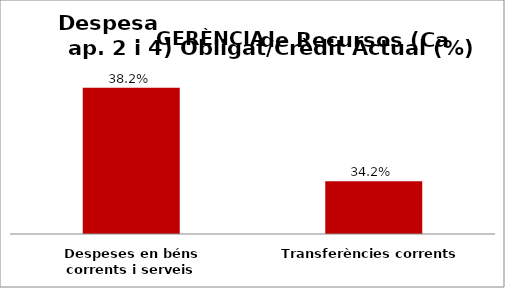
| Category | Series 0 |
|---|---|
| Despeses en béns corrents i serveis | 0.382 |
| Transferències corrents | 0.342 |